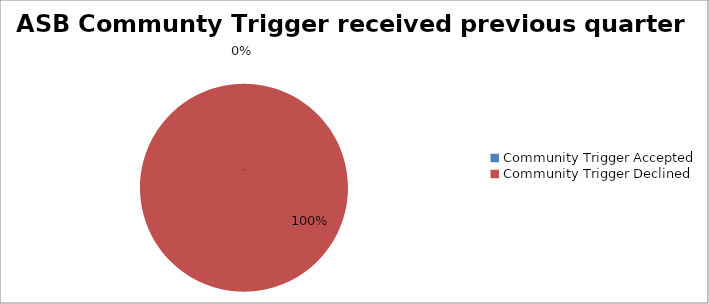
| Category | Series 0 |
|---|---|
| Community Trigger Accepted | 0 |
| Community Trigger Declined | 5 |